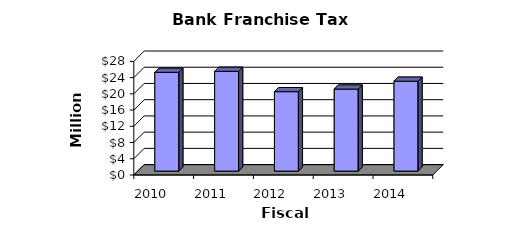
| Category | Series 0 |
|---|---|
| 2010.0 | 24343000 |
| 2011.0 | 24580000 |
| 2012.0 | 19570000 |
| 2013.0 | 20202000 |
| 2014.0 | 22149000 |